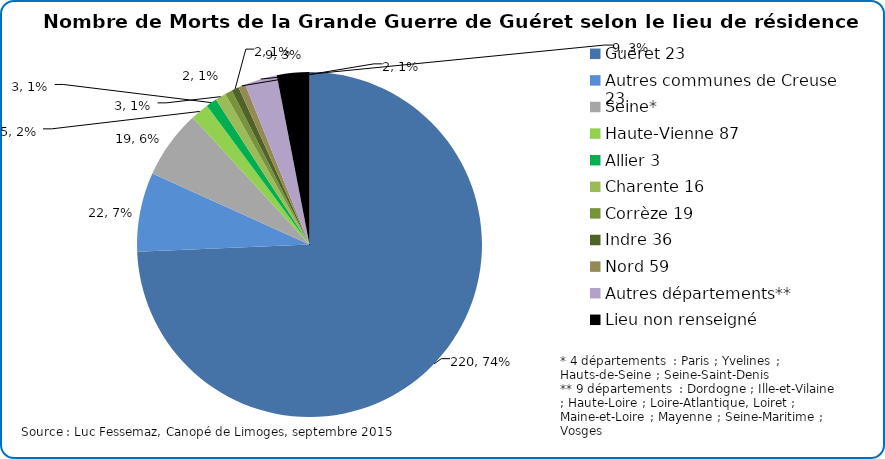
| Category | Nombre de Morts de la Grande Guerre selon le lieu de résidence |
|---|---|
| 0 | 220 |
| 1 | 22 |
| 2 | 19 |
| 3 | 5 |
| 4 | 3 |
| 5 | 3 |
| 6 | 2 |
| 7 | 2 |
| 8 | 2 |
| 9 | 9 |
| 10 | 9 |